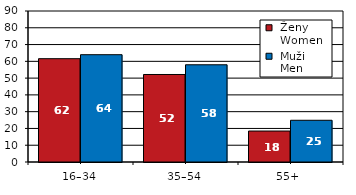
| Category |  Ženy 
 Women |  Muži 
 Men |
|---|---|---|
| 16–34 | 61.58 | 63.96 |
| 35–54 | 52.16 | 57.95 |
| 55+  | 18.45 | 24.87 |